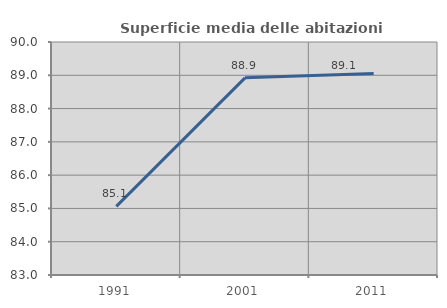
| Category | Superficie media delle abitazioni occupate |
|---|---|
| 1991.0 | 85.061 |
| 2001.0 | 88.923 |
| 2011.0 | 89.051 |